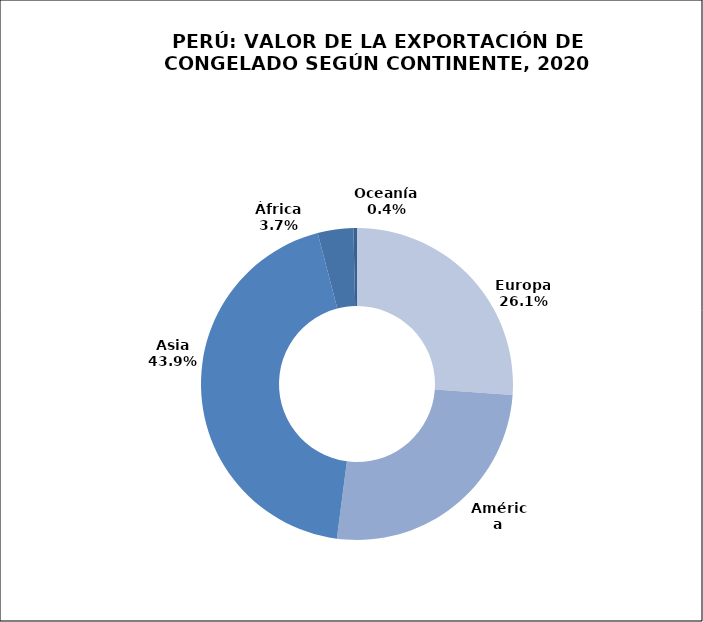
| Category | Series 0 |
|---|---|
| Europa | 296342.765 |
| América | 294389.095 |
| Asia | 497831.906 |
| África | 41871.478 |
| Oceanía | 4182.588 |